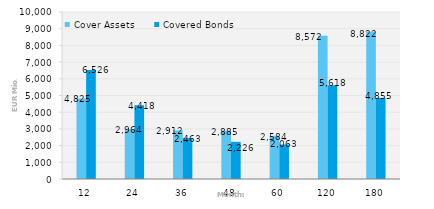
| Category | Cover Assets | Covered Bonds |
|---|---|---|
| 12.0 | 4824.5 | 6525.7 |
| 24.0 | 2964.3 | 4417.5 |
| 36.0 | 2911.6 | 2462.5 |
| 48.0 | 2884.8 | 2225.9 |
| 60.0 | 2583.6 | 2063 |
| 120.0 | 8572.2 | 5617.8 |
| 180.0 | 8822.3 | 4854.9 |